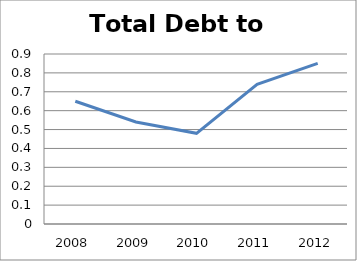
| Category | Series 0 |
|---|---|
| 2008.0 | 0.65 |
| 2009.0 | 0.54 |
| 2010.0 | 0.48 |
| 2011.0 | 0.74 |
| 2012.0 | 0.85 |